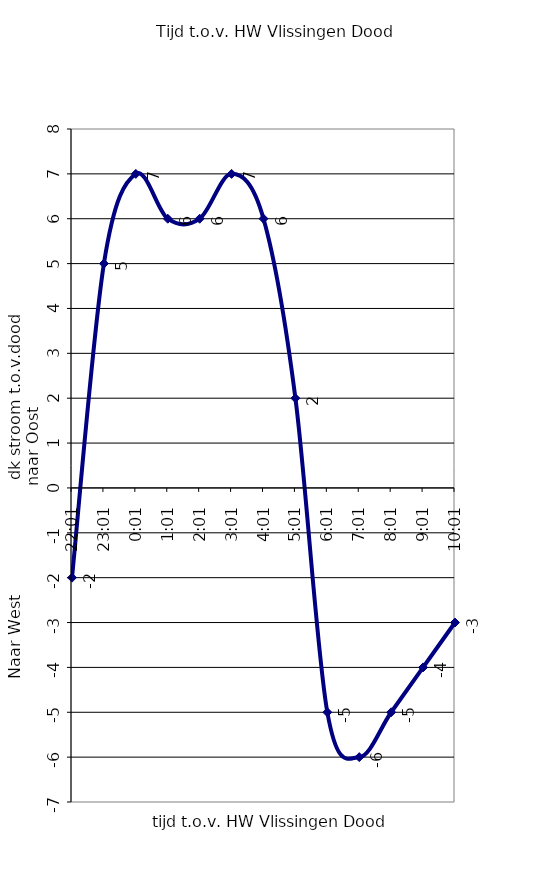
| Category | Series 0 |
|---|---|
| 1900-01-05 22:01:00 | -2 |
| 1900-01-04 23:01:00 | 5 |
| 1900-01-04 00:01:00 | 7 |
| 1900-01-03 01:01:00 | 6 |
| 1900-01-02 02:01:00 | 6 |
| 1900-01-01 03:01:00 | 7 |
| 0.1673611111111111 | 6 |
| 1900-01-01 05:01:00 | 2 |
| 1900-01-02 06:01:00 | -5 |
| 1900-01-03 07:01:00 | -6 |
| 1900-01-04 08:01:00 | -5 |
| 1900-01-05 09:01:00 | -4 |
| 1900-01-06 10:01:00 | -3 |